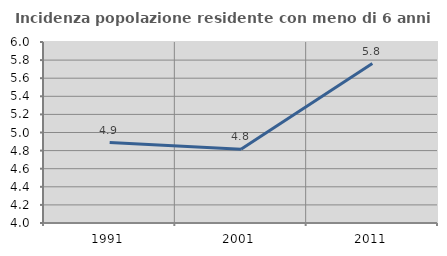
| Category | Incidenza popolazione residente con meno di 6 anni |
|---|---|
| 1991.0 | 4.889 |
| 2001.0 | 4.815 |
| 2011.0 | 5.761 |